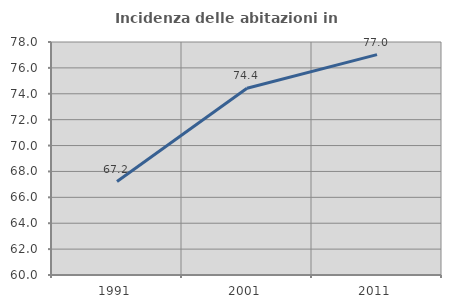
| Category | Incidenza delle abitazioni in proprietà  |
|---|---|
| 1991.0 | 67.217 |
| 2001.0 | 74.431 |
| 2011.0 | 77.027 |